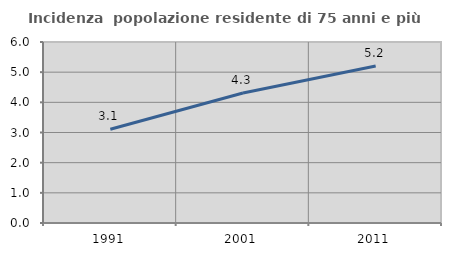
| Category | Incidenza  popolazione residente di 75 anni e più |
|---|---|
| 1991.0 | 3.109 |
| 2001.0 | 4.308 |
| 2011.0 | 5.202 |